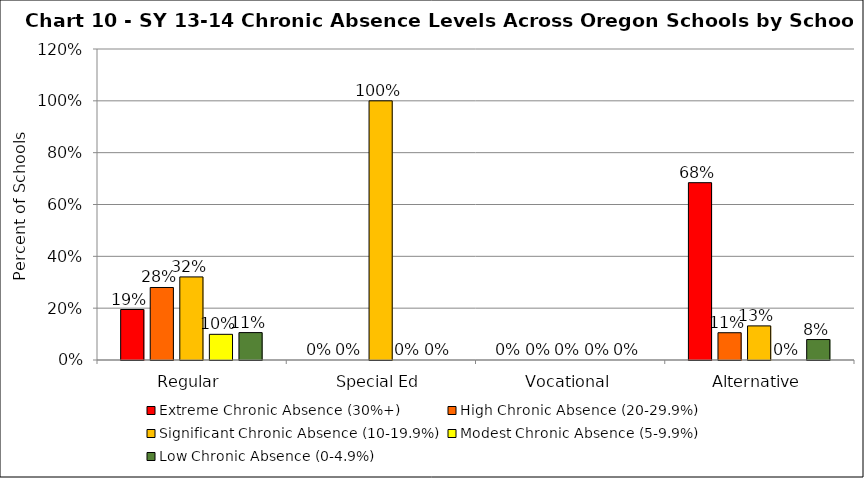
| Category | Extreme Chronic Absence (30%+) | High Chronic Absence (20-29.9%) | Significant Chronic Absence (10-19.9%) | Modest Chronic Absence (5-9.9%) | Low Chronic Absence (0-4.9%) |
|---|---|---|---|---|---|
| 0 | 0.195 | 0.28 | 0.321 | 0.099 | 0.106 |
| 1 | 0 | 0 | 1 | 0 | 0 |
| 2 | 0 | 0 | 0 | 0 | 0 |
| 3 | 0.684 | 0.105 | 0.132 | 0 | 0.079 |